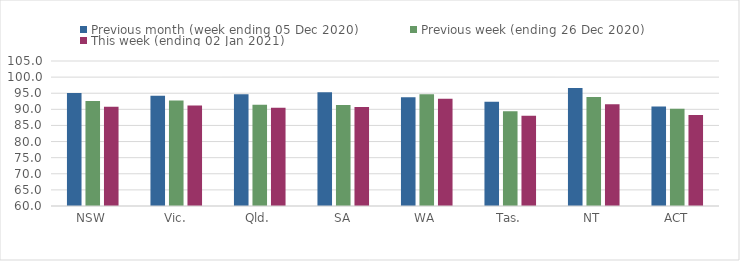
| Category | Previous month (week ending 05 Dec 2020) | Previous week (ending 26 Dec 2020) | This week (ending 02 Jan 2021) |
|---|---|---|---|
| NSW | 95.07 | 92.6 | 90.81 |
| Vic. | 94.25 | 92.76 | 91.2 |
| Qld. | 94.69 | 91.42 | 90.46 |
| SA | 95.32 | 91.35 | 90.73 |
| WA | 93.76 | 94.71 | 93.31 |
| Tas. | 92.33 | 89.38 | 88.02 |
| NT | 96.6 | 93.83 | 91.61 |
| ACT | 90.85 | 90.21 | 88.25 |